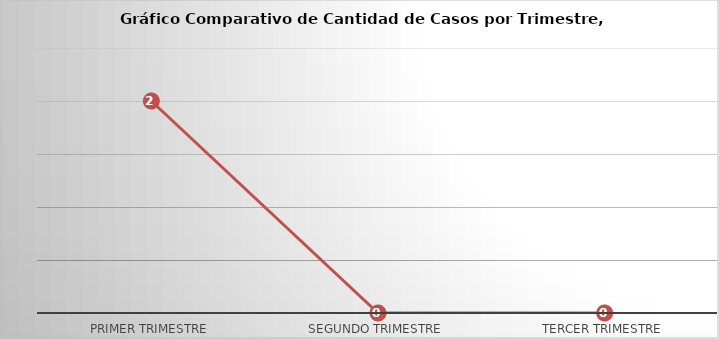
| Category | Series 0 |
|---|---|
| Primer Trimestre | 2 |
| Segundo Trimestre | 0 |
| Tercer Trimestre | 0 |